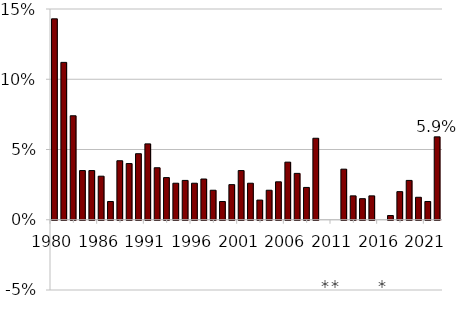
| Category | Series 0 |
|---|---|
| 1980-07-01 | 0.143 |
| 1981-07-01 | 0.112 |
| 1982-07-01 | 0.074 |
| 1984-01-01 | 0.035 |
| 1985-01-01 | 0.035 |
| 1986-01-01 | 0.031 |
| 1987-01-01 | 0.013 |
| 1988-01-01 | 0.042 |
| 1989-01-01 | 0.04 |
| 1990-01-01 | 0.047 |
| 1991-01-01 | 0.054 |
| 1992-01-01 | 0.037 |
| 1993-01-01 | 0.03 |
| 1994-01-01 | 0.026 |
| 1995-01-01 | 0.028 |
| 1996-01-01 | 0.026 |
| 1997-01-01 | 0.029 |
| 1998-01-01 | 0.021 |
| 1999-01-01 | 0.013 |
| 2000-01-01 | 0.025 |
| 2001-01-01 | 0.035 |
| 2002-01-01 | 0.026 |
| 2003-01-01 | 0.014 |
| 2004-01-01 | 0.021 |
| 2005-01-01 | 0.027 |
| 2006-01-01 | 0.041 |
| 2007-01-01 | 0.033 |
| 2008-01-01 | 0.023 |
| 2009-01-01 | 0.058 |
| 2010-01-01 | 0 |
| 2011-01-01 | 0 |
| 2012-01-01 | 0.036 |
| 2013-01-01 | 0.017 |
| 2014-01-01 | 0.015 |
| 2015-01-01 | 0.017 |
| 2016-01-01 | 0 |
| 2017-01-01 | 0.003 |
| 2018-01-01 | 0.02 |
| 2019-01-01 | 0.028 |
| 2020-01-01 | 0.016 |
| 2021-01-01 | 0.013 |
| 2022-01-01 | 0.059 |